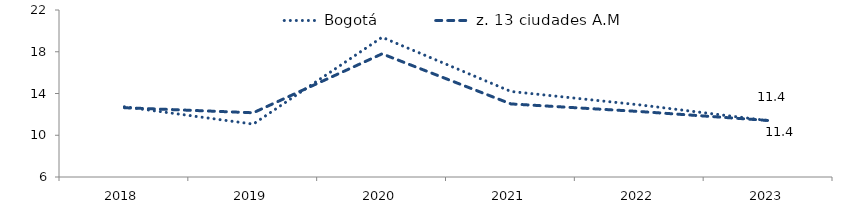
| Category | Bogotá | z. 13 ciudades A.M |
|---|---|---|
| 2018.0 | 12.73 | 12.637 |
| 2019.0 | 11.067 | 12.153 |
| 2020.0 | 19.389 | 17.8 |
| 2021.0 | 14.194 | 13.002 |
| 2022.0 | 12.91 | 12.273 |
| 2023.0 | 11.395 | 11.412 |